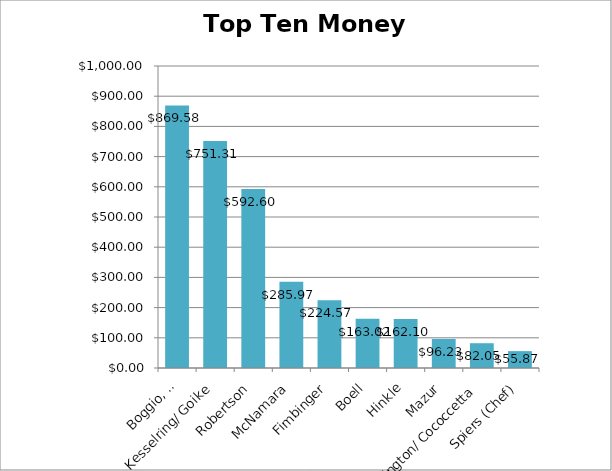
| Category | Total Money Raised |
|---|---|
| Boggio, R. | 869.58 |
| Kesselring/ Goike | 751.31 |
| Robertson | 592.6 |
| McNamara | 285.97 |
| Fimbinger | 224.57 |
| Boell | 163.02 |
| Hinkle | 162.1 |
| Mazur | 96.23 |
| Ferrington/ Cococcetta | 82.05 |
| Spiers (Chef) | 55.87 |